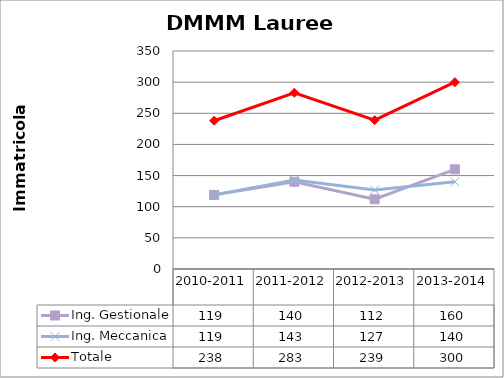
| Category | Ing. Gestionale | Ing. Meccanica | Totale |
|---|---|---|---|
| 2010-2011 | 119 | 119 | 238 |
| 2011-2012 | 140 | 143 | 283 |
| 2012-2013 | 112 | 127 | 239 |
| 2013-2014 | 160 | 140 | 300 |